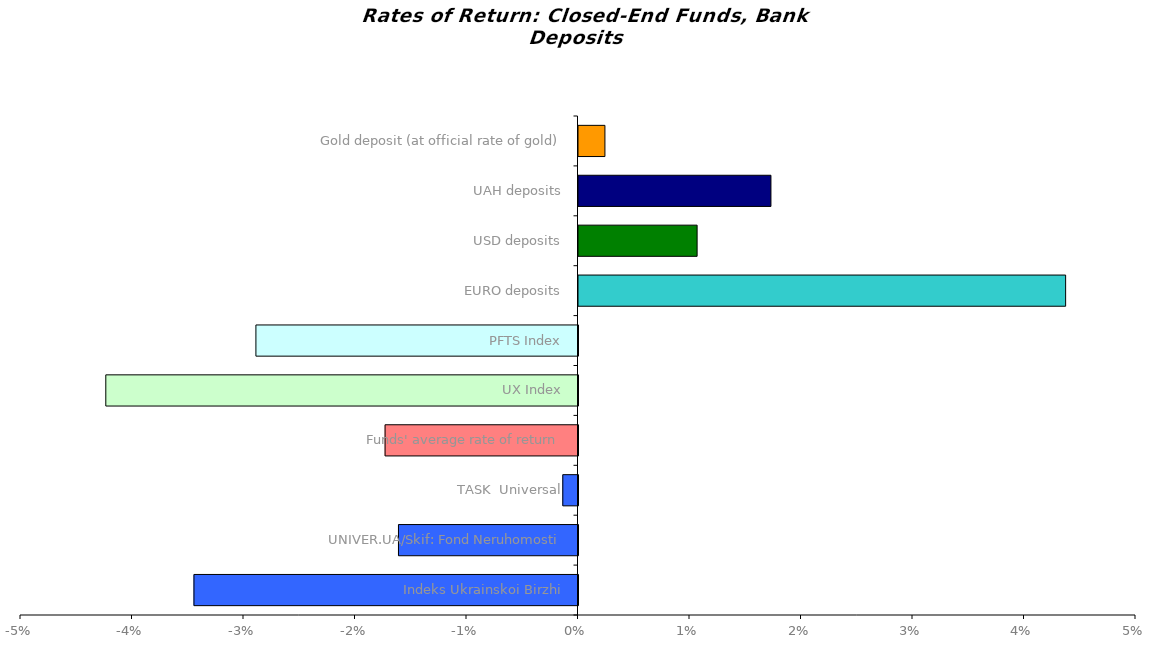
| Category | Series 0 |
|---|---|
| Indeks Ukrainskoi Birzhi | -0.034 |
| UNIVER.UA/Skif: Fond Neruhomosti | -0.016 |
| TASK  Universal | -0.001 |
| Funds' average rate of return | -0.017 |
| UX Index | -0.042 |
| PFTS Index | -0.029 |
| EURO deposits | 0.044 |
| USD deposits | 0.011 |
| UAH deposits | 0.017 |
| Gold deposit (at official rate of gold) | 0.002 |